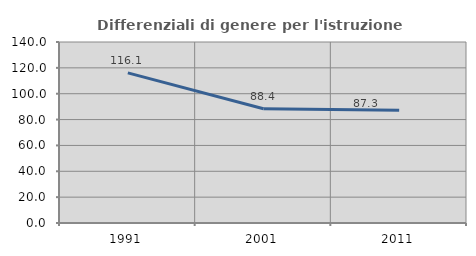
| Category | Differenziali di genere per l'istruzione superiore |
|---|---|
| 1991.0 | 116.104 |
| 2001.0 | 88.401 |
| 2011.0 | 87.273 |